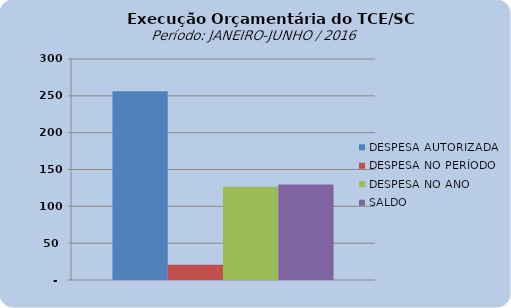
| Category | DESPESA AUTORIZADA | DESPESA NO PERÍODO | DESPESA NO ANO | SALDO |
|---|---|---|---|---|
| 0 | 256185569.31 | 20857224.71 | 126595764.34 | 129589804.97 |